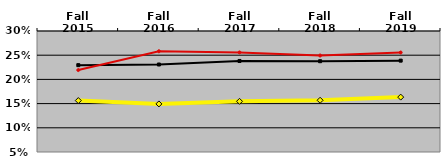
| Category | NATIONAL MEDIAN | WEST MEDIAN | TEXAS LUTHERAN |
|---|---|---|---|
| Fall 2015 | 0.229 | 0.219 | 0.156 |
| Fall 2016 | 0.231 | 0.258 | 0.149 |
| Fall 2017 | 0.238 | 0.256 | 0.155 |
| Fall 2018 | 0.238 | 0.249 | 0.157 |
| Fall 2019 | 0.239 | 0.256 | 0.163 |